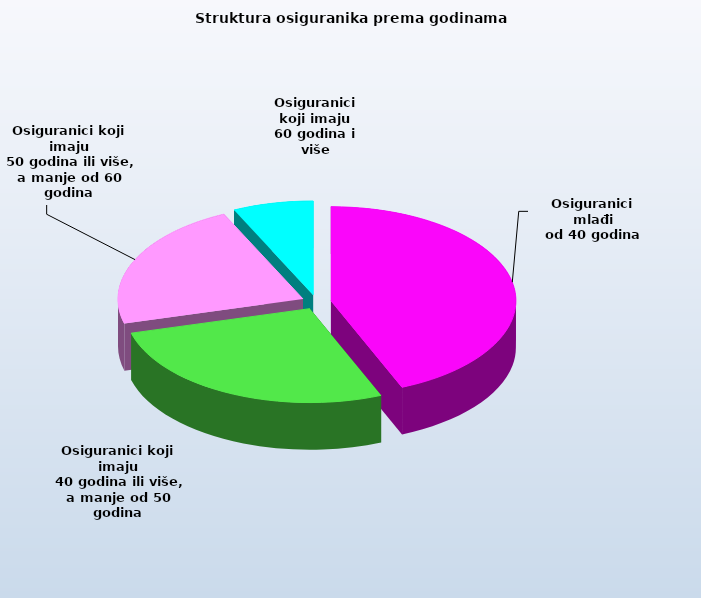
| Category | Series 0 |
|---|---|
| Osiguranici mlađi
od 40 godina | 702281 |
| Osiguranici koji imaju
 40 godina ili više, a manje od 50 godina | 435168 |
| Osiguranici koji imaju
 50 godina ili više, a manje od 60 godina | 356038 |
| Osiguranici koji imaju
60 godina i više | 113046 |